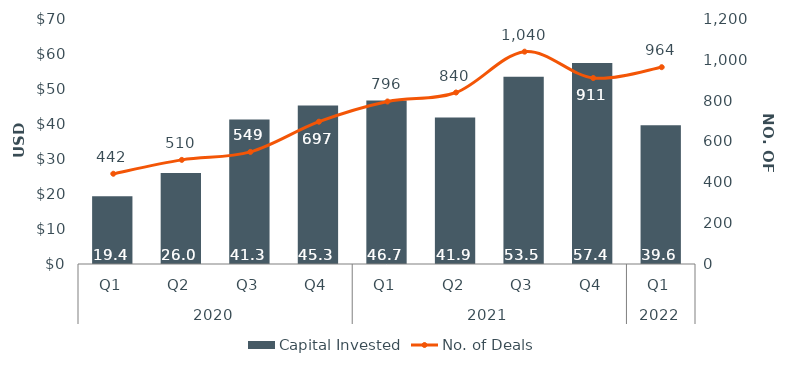
| Category | Capital Invested |
|---|---|
| 0 | 19.362 |
| 1 | 25.976 |
| 2 | 41.253 |
| 3 | 45.297 |
| 4 | 46.694 |
| 5 | 41.865 |
| 6 | 53.52 |
| 7 | 57.428 |
| 8 | 39.633 |